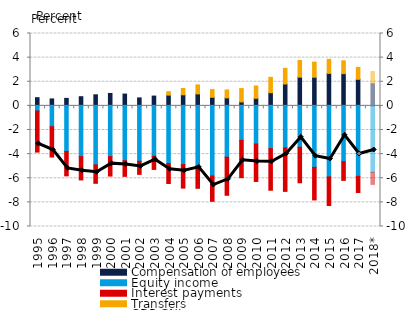
| Category | Compensation of employees | Equity income | Interest payments | Transfers |
|---|---|---|---|---|
| 1995 | 0.68 | -0.426 | -3.405 | 0 |
| 1996 | 0.576 | -1.727 | -2.513 | 0 |
| 1997 | 0.62 | -3.785 | -2.015 | 0 |
| 1998 | 0.76 | -4.21 | -1.93 | 0 |
| 1999 | 0.919 | -4.893 | -1.526 | 0 |
| 2000 | 1.029 | -4.208 | -1.61 | 0 |
| 2001 | 0.978 | -4.543 | -1.3 | 0 |
| 2002 | 0.661 | -4.594 | -1.083 | 0 |
| 2003 | 0.811 | -4.179 | -1.091 | 0 |
| 2004 | 0.887 | -4.784 | -1.651 | 0.291 |
| 2005 | 0.921 | -4.865 | -1.951 | 0.52 |
| 2006 | 0.991 | -4.964 | -1.869 | 0.745 |
| 2007 | 0.71 | -5.808 | -2.103 | 0.639 |
| 2008 | 0.664 | -4.255 | -3.158 | 0.657 |
| 2009 | 0.329 | -2.86 | -3.091 | 1.105 |
| 2010 | 0.629 | -3.165 | -3.101 | 1.017 |
| 2011 | 1.09 | -3.545 | -3.45 | 1.277 |
| 2012 | 1.816 | -3.476 | -3.611 | 1.293 |
| 2013 | 2.381 | -3.431 | -2.945 | 1.384 |
| 2014 | 2.373 | -5.097 | -2.701 | 1.254 |
| 2015 | 2.693 | -5.885 | -2.379 | 1.162 |
| 2016 | 2.669 | -4.631 | -1.544 | 1.067 |
| 2017 | 2.203 | -5.838 | -1.343 | 0.985 |
| 2018* | 1.851 | -5.505 | -1.002 | 0.996 |